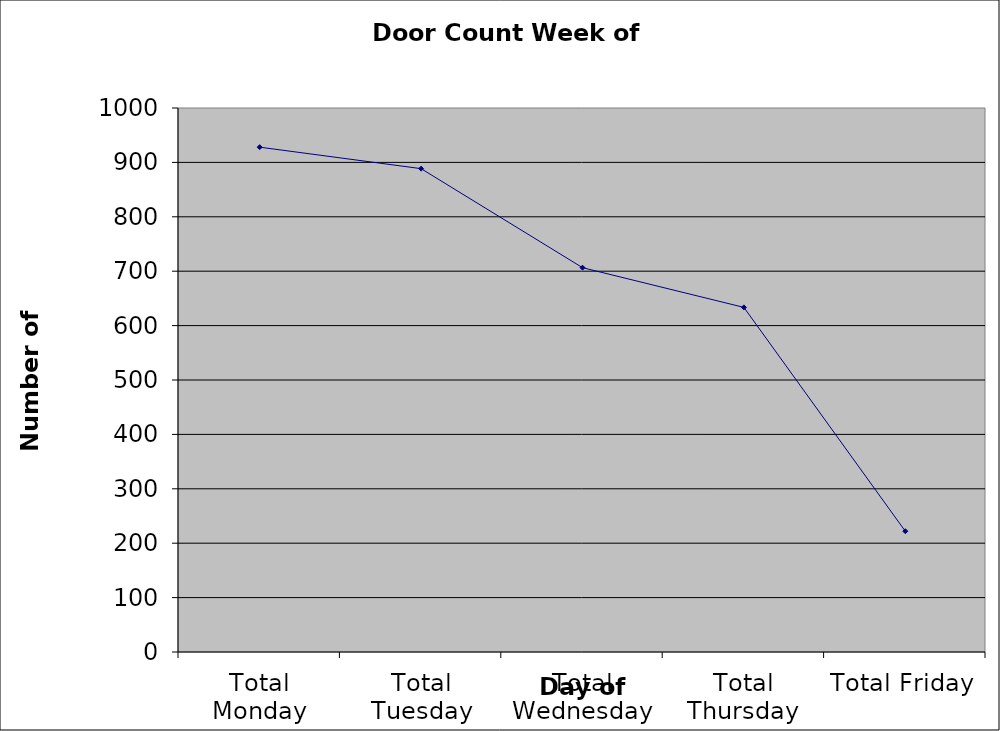
| Category | Series 0 |
|---|---|
| Total Monday | 928 |
| Total Tuesday | 888.5 |
| Total Wednesday | 706.5 |
| Total Thursday | 633.5 |
| Total Friday | 222 |